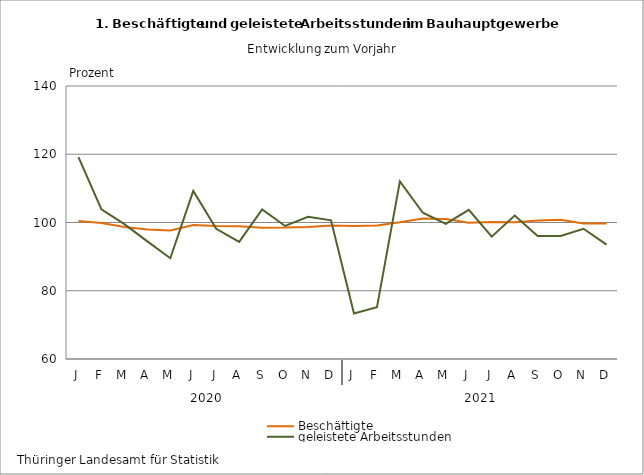
| Category | Beschäftigte | geleistete Arbeitsstunden |
|---|---|---|
| J | 100.409 | 119.151 |
| F | 99.868 | 103.832 |
| M | 98.676 | 99.505 |
| A | 97.976 | 94.468 |
| M | 97.664 | 89.538 |
| J | 99.276 | 109.247 |
| J | 98.996 | 98.152 |
| A | 98.908 | 94.324 |
| S | 98.449 | 103.811 |
| O | 98.499 | 98.979 |
| N | 98.7 | 101.654 |
| D | 99.116 | 100.628 |
| J | 98.957 | 73.355 |
| F | 99.144 | 75.145 |
| M | 100.063 | 112.039 |
| A | 101.165 | 102.859 |
| M | 100.998 | 99.625 |
| J | 99.917 | 103.729 |
| J | 100.166 | 95.854 |
| A | 100.095 | 102.019 |
| S | 100.569 | 96.039 |
| O | 100.783 | 96.077 |
| N | 99.71 | 98.17 |
| D | 99.707 | 93.499 |